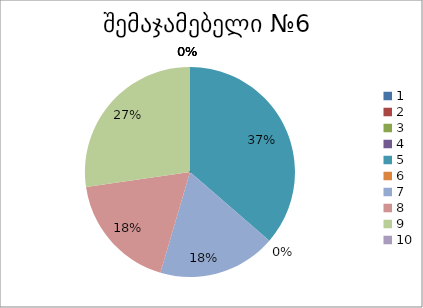
| Category | რაოდენობა | ქულა |
|---|---|---|
| 0 | 0 | 1 |
| 1 | 0 | 2 |
| 2 | 0 | 3 |
| 3 | 0 | 4 |
| 4 | 4 | 5 |
| 5 | 0 | 6 |
| 6 | 2 | 7 |
| 7 | 2 | 8 |
| 8 | 3 | 9 |
| 9 | 0 | 10 |